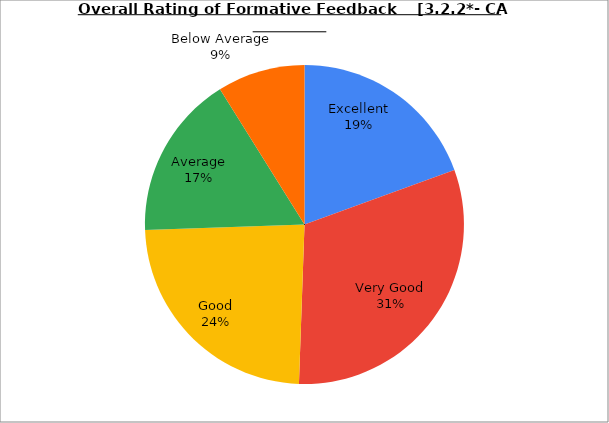
| Category | Series 0 |
|---|---|
| Excellent | 19.444 |
| Very Good | 31.111 |
| Good | 23.889 |
| Average | 16.667 |
| Below Average | 8.889 |